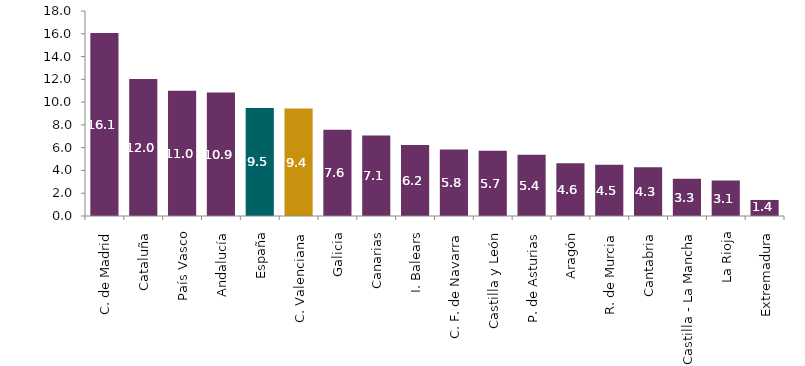
| Category | Series 0 |
|---|---|
| C. de Madrid | 16.07 |
| Cataluña | 12.03 |
| País Vasco | 11 |
| Andalucía | 10.85 |
| España | 9.49 |
| C. Valenciana | 9.44 |
| Galicia | 7.58 |
| Canarias | 7.07 |
| I. Balears | 6.24 |
| C. F. de Navarra | 5.83 |
| Castilla y León | 5.73 |
| P. de Asturias | 5.38 |
| Aragón | 4.63 |
| R. de Murcia | 4.51 |
| Cantabria | 4.28 |
| Castilla - La Mancha | 3.27 |
| La Rioja | 3.11 |
| Extremadura | 1.41 |